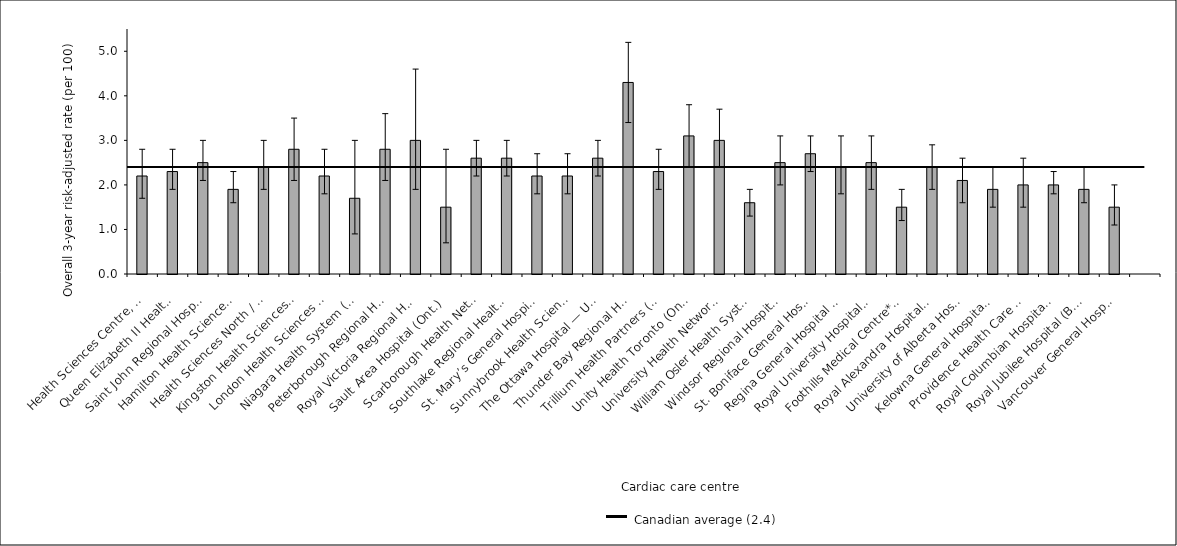
| Category | Risk-adjusted rate |
|---|---|
| Health Sciences Centre, St. John’s (N.L.) | 2.2 |
| Queen Elizabeth II Health Sciences Centre (N.S.) | 2.3 |
| Saint John Regional Hospital (N.B.) | 2.5 |
| Hamilton Health Sciences* (Ont.) | 1.9 |
| Health Sciences North / Horizon Santé-Nord (Ont.) | 2.4 |
| Kingston Health Sciences Centre (Ont.) | 2.8 |
| London Health Sciences Centre (Ont.) | 2.2 |
| Niagara Health System (Ont.) | 1.7 |
| Peterborough Regional Health Centre (Ont.) | 2.8 |
| Royal Victoria Regional Health Centre (Ont.) | 3 |
| Sault Area Hospital (Ont.) | 1.5 |
| Scarborough Health Network (Ont.) | 2.6 |
| Southlake Regional Health Centre (Ont.) | 2.6 |
| St. Mary’s General Hospital (Ont.) | 2.2 |
| Sunnybrook Health Sciences Centre (Ont.) | 2.2 |
| The Ottawa Hospital — University of Ottawa Heart Institute (Ont.) | 2.6 |
| Thunder Bay Regional Health Sciences Centre* (Ont.) | 4.3 |
| Trillium Health Partners (Ont.) | 2.3 |
| Unity Health Toronto (Ont.) | 3.1 |
| University Health Network (Ont.) | 3 |
| William Osler Health System* (Ont.) | 1.6 |
| Windsor Regional Hospital (Ont.) | 2.5 |
| St. Boniface General Hospital (Man.) | 2.7 |
| Regina General Hospital (Sask.) | 2.4 |
| Royal University Hospital (Sask.) | 2.5 |
| Foothills Medical Centre* (Alta.) | 1.5 |
| Royal Alexandra Hospital (Alta.) | 2.4 |
| University of Alberta Hospital (Alta.) | 2.1 |
| Kelowna General Hospital (B.C.) | 1.9 |
| Providence Health Care — St. Paul’s Hospital (Vancouver) (B.C.) | 2 |
| Royal Columbian Hospital* (B.C.) | 2 |
| Royal Jubilee Hospital (B.C.) | 1.9 |
| Vancouver General Hospital* (B.C.) | 1.5 |